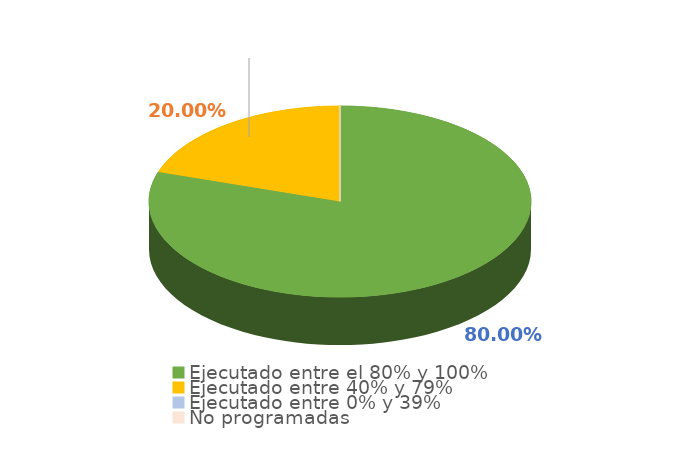
| Category | Series 0 |
|---|---|
| Ejecutado entre el 80% y 100% | 0.8 |
| Ejecutado entre 40% y 79% | 0.2 |
| Ejecutado entre 0% y 39% | 0 |
| No programadas | 0 |